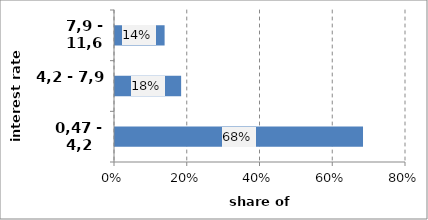
| Category | Series 0 |
|---|---|
| 0,47 - 4,2 | 0.682 |
| 4,2 - 7,9 | 0.182 |
| 7,9 - 11,6 | 0.136 |